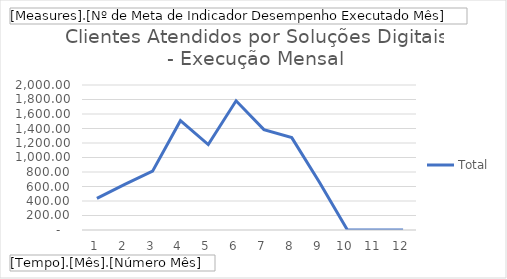
| Category | Total |
|---|---|
| 1 | 435 |
| 2 | 629 |
| 3 | 812 |
| 4 | 1508 |
| 5 | 1178 |
| 6 | 1782 |
| 7 | 1385 |
| 8 | 1274 |
| 9 | 656 |
| 10 | 0 |
| 11 | 0 |
| 12 | 0 |